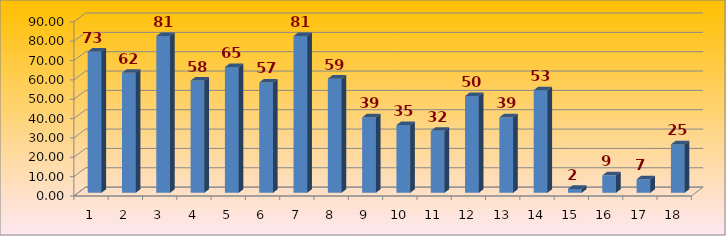
| Category | Середній |
|---|---|
| 0 | 73 |
| 1 | 62 |
| 2 | 81 |
| 3 | 58 |
| 4 | 65 |
| 5 | 57 |
| 6 | 81 |
| 7 | 59 |
| 8 | 39 |
| 9 | 35 |
| 10 | 32 |
| 11 | 50 |
| 12 | 39 |
| 13 | 53 |
| 14 | 2 |
| 15 | 9 |
| 16 | 7 |
| 17 | 25 |